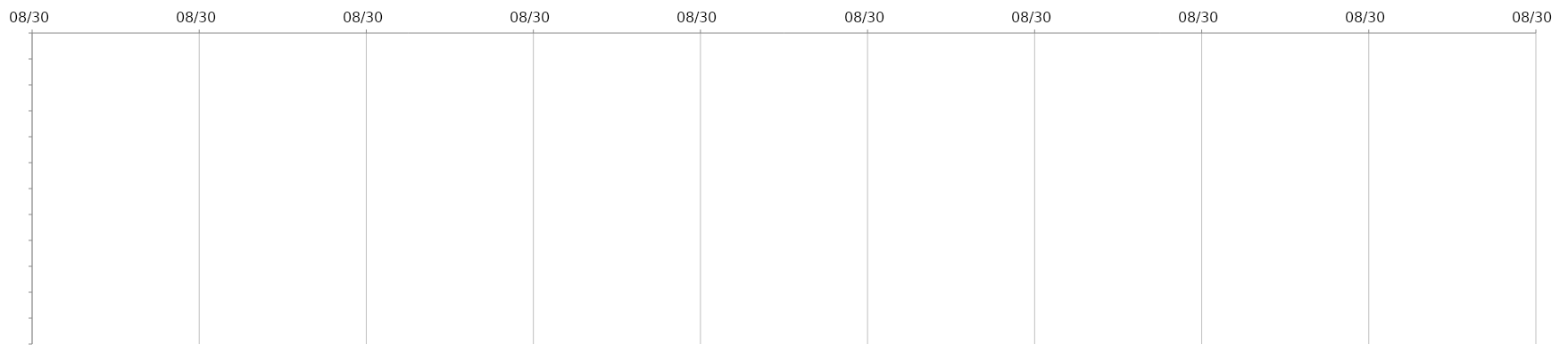
| Category | INICIO | DÍAS |
|---|---|---|
|  |  | 0 |
|  |  | 0 |
|  |  | 0 |
|  |  | 0 |
|  |  | 0 |
|  |  | 0 |
|  |  | 0 |
|  |  | 0 |
|  |  | 0 |
|  |  | 0 |
|  |  | 0 |
|  |  | 0 |